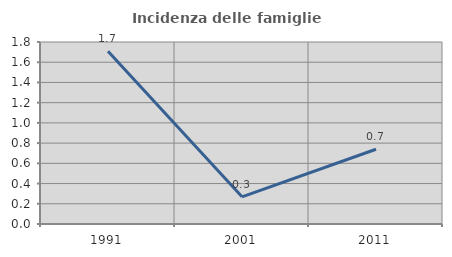
| Category | Incidenza delle famiglie numerose |
|---|---|
| 1991.0 | 1.709 |
| 2001.0 | 0.269 |
| 2011.0 | 0.739 |